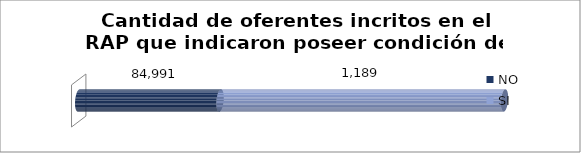
| Category | NO | SI |
|---|---|---|
| 0 | 84991 | 1189 |